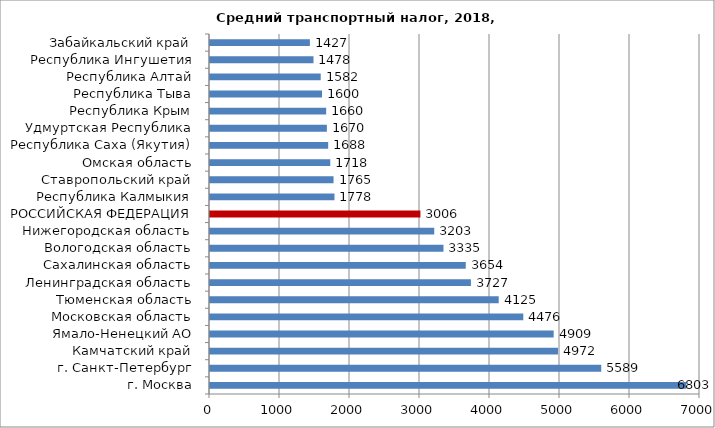
| Category | Средний налог 2018 |
|---|---|
| г. Москва | 6803.39 |
| г. Санкт-Петербург | 5589.182 |
| Камчатский край | 4971.919 |
| Ямало-Ненецкий АО | 4909.291 |
| Московская область | 4475.696 |
| Тюменская область | 4124.522 |
| Ленинградская область | 3727.482 |
| Сахалинская область | 3653.615 |
| Вологодская область | 3335.208 |
| Нижегородская область | 3203.432 |
| РОССИЙСКАЯ ФЕДЕРАЦИЯ | 3005.94 |
| Республика Калмыкия | 1778.166 |
| Ставропольский край | 1764.938 |
| Омская область | 1718.253 |
| Республика Саха (Якутия) | 1688.39 |
| Удмуртская Республика | 1669.724 |
| Республика Крым | 1659.744 |
| Республика Тыва | 1600.006 |
| Республика Алтай | 1581.586 |
| Республика Ингушетия | 1478.466 |
| Забайкальский край | 1427.268 |